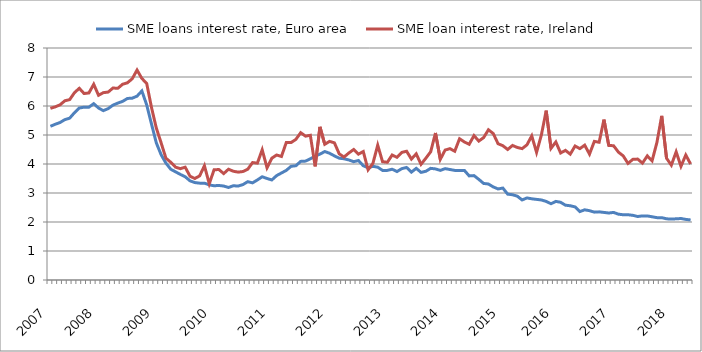
| Category | SME loans interest rate, Euro area | SME loan interest rate, Ireland |
|---|---|---|
| 2007.0 | 5.3 | 5.92 |
| nan | 5.37 | 5.97 |
| nan | 5.43 | 6.04 |
| nan | 5.53 | 6.18 |
| nan | 5.58 | 6.22 |
| nan | 5.77 | 6.46 |
| nan | 5.93 | 6.61 |
| nan | 5.96 | 6.43 |
| nan | 5.96 | 6.45 |
| nan | 6.08 | 6.75 |
| 2008.0 | 5.93 | 6.37 |
| nan | 5.84 | 6.46 |
| nan | 5.91 | 6.48 |
| nan | 6.03 | 6.62 |
| nan | 6.1 | 6.61 |
| nan | 6.16 | 6.75 |
| nan | 6.26 | 6.8 |
| nan | 6.27 | 6.94 |
| nan | 6.34 | 7.24 |
| nan | 6.52 | 6.95 |
| nan | 6.04 | 6.78 |
| nan | 5.38 | 5.95 |
| 2009.0 | 4.73 | 5.24 |
| nan | 4.32 | 4.73 |
| nan | 4.03 | 4.2 |
| nan | 3.82 | 4.06 |
| nan | 3.73 | 3.89 |
| nan | 3.64 | 3.84 |
| nan | 3.56 | 3.89 |
| nan | 3.42 | 3.58 |
| nan | 3.36 | 3.5 |
| nan | 3.34 | 3.59 |
| nan | 3.34 | 3.94 |
| nan | 3.28 | 3.32 |
| 2010.0 | 3.25 | 3.8 |
| nan | 3.26 | 3.81 |
| nan | 3.24 | 3.67 |
| nan | 3.19 | 3.82 |
| nan | 3.25 | 3.75 |
| nan | 3.24 | 3.72 |
| nan | 3.29 | 3.74 |
| nan | 3.39 | 3.82 |
| nan | 3.35 | 4.05 |
| nan | 3.45 | 4.03 |
| nan | 3.56 | 4.49 |
| nan | 3.5 | 3.87 |
| 2011.0 | 3.45 | 4.2 |
| nan | 3.6 | 4.31 |
| nan | 3.69 | 4.26 |
| nan | 3.78 | 4.74 |
| nan | 3.92 | 4.74 |
| nan | 3.94 | 4.85 |
| nan | 4.09 | 5.08 |
| nan | 4.1 | 4.96 |
| nan | 4.18 | 4.99 |
| nan | 4.27 | 3.92 |
| nan | 4.34 | 5.28 |
| nan | 4.43 | 4.68 |
| 2012.0 | 4.37 | 4.78 |
| nan | 4.28 | 4.73 |
| nan | 4.2 | 4.35 |
| nan | 4.18 | 4.24 |
| nan | 4.14 | 4.38 |
| nan | 4.08 | 4.5 |
| nan | 4.12 | 4.34 |
| nan | 3.94 | 4.43 |
| nan | 3.87 | 3.8 |
| nan | 3.92 | 4.02 |
| nan | 3.89 | 4.65 |
| nan | 3.78 | 4.08 |
| 2013.0 | 3.78 | 4.06 |
| nan | 3.82 | 4.31 |
| nan | 3.74 | 4.23 |
| nan | 3.84 | 4.4 |
| nan | 3.88 | 4.44 |
| nan | 3.72 | 4.17 |
| nan | 3.85 | 4.35 |
| nan | 3.71 | 3.99 |
| nan | 3.75 | 4.2 |
| nan | 3.85 | 4.42 |
| nan | 3.83 | 5.07 |
| nan | 3.78 | 4.16 |
| 2014.0 | 3.84 | 4.48 |
| nan | 3.81 | 4.53 |
| nan | 3.78 | 4.44 |
| nan | 3.78 | 4.87 |
| nan | 3.78 | 4.76 |
| nan | 3.59 | 4.68 |
| nan | 3.6 | 4.98 |
| nan | 3.47 | 4.79 |
| nan | 3.33 | 4.91 |
| nan | 3.31 | 5.18 |
| nan | 3.21 | 5.05 |
| nan | 3.14 | 4.7 |
| 2015.0 | 3.17 | 4.63 |
| nan | 2.96 | 4.5 |
| nan | 2.94 | 4.64 |
| nan | 2.89 | 4.57 |
| nan | 2.76 | 4.53 |
| nan | 2.83 | 4.66 |
| nan | 2.8 | 4.97 |
| nan | 2.78 | 4.4 |
| nan | 2.76 | 5 |
| nan | 2.71 | 5.84 |
| nan | 2.63 | 4.54 |
| 2016.0 | 2.71 | 4.76 |
| nan | 2.68 | 4.38 |
| nan | 2.58 | 4.47 |
| nan | 2.56 | 4.34 |
| nan | 2.52 | 4.62 |
| nan | 2.36 | 4.53 |
| nan | 2.42 | 4.65 |
| nan | 2.39 | 4.34 |
| nan | 2.34 | 4.78 |
| nan | 2.35 | 4.75 |
| nan | 2.33 | 5.53 |
| nan | 2.31 | 4.64 |
| 2017.0 | 2.33 | 4.63 |
| nan | 2.27 | 4.41 |
| nan | 2.25 | 4.28 |
| nan | 2.25 | 4.02 |
| nan | 2.23 | 4.16 |
| nan | 2.19 | 4.17 |
| nan | 2.21 | 4.03 |
| nan | 2.21 | 4.28 |
| nan | 2.18 | 4.11 |
| nan | 2.15 | 4.74 |
| nan | 2.15 | 5.66 |
| nan | 2.11 | 4.2 |
| 2018.0 | 2.1 | 3.96 |
| nan | 2.11 | 4.42 |
| nan | 2.12 | 3.92 |
| nan | 2.09 | 4.31 |
| nan | 2.07 | 4 |